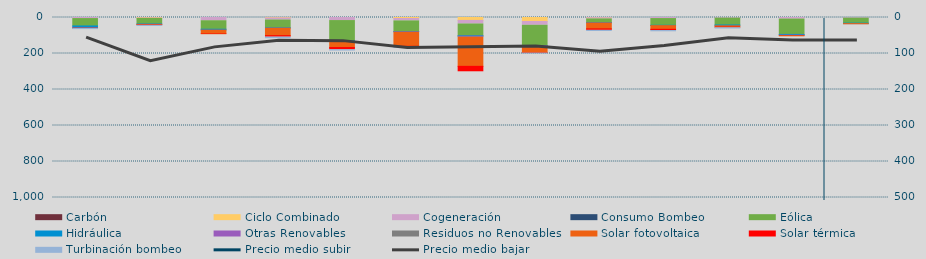
| Category | Carbón | Ciclo Combinado | Cogeneración | Consumo Bombeo | Eólica | Hidráulica | Otras Renovables | Residuos no Renovables | Solar fotovoltaica | Solar térmica | Turbinación bombeo |
|---|---|---|---|---|---|---|---|---|---|---|---|
| 0 | 0 | 0 | 5902.2 | 0 | 40924.6 | 10096 | 2210.8 | 541.2 | 397.2 | 861 | 700 |
| 1 | 0 | 2180.9 | 2937.8 | 0 | 30839.8 | 1899.6 | 565.6 | 0 | 1849.2 | 2802 | 1100 |
| 2 | 0 | 0 | 18046.2 | 0 | 47159 | 4513.5 | 523.7 | 0 | 19900.6 | 2658.1 | 0 |
| 3 | 0 | 2280 | 11810.8 | 0 | 43127.1 | 1164.1 | 1123.7 | 0 | 41530.2 | 8077.8 | 3040.7 |
| 4 | 0 | 0 | 17047.5 | 0 | 112869.5 | 3513.3 | 2033.2 | 0 | 31386.8 | 12440.9 | 1549.6 |
| 5 | 0 | 5564.7 | 13323.5 | 0 | 59321.6 | 487.1 | 2690.6 | 340 | 78205.9 | 6474.7 | 234.9 |
| 6 | 0 | 16258.4 | 19750 | 0 | 65114.4 | 2681.9 | 4946 | 396 | 162175.4 | 30259.6 | 0 |
| 7 | 0 | 22358.6 | 20882.5 | 0 | 113586.9 | 821.8 | 5978.7 | 1618 | 30024.6 | 2441 | 100 |
| 8 | 0 | 1223.5 | 6632.4 | 0 | 20394.4 | 842.9 | 1487.4 | 0 | 32658.5 | 8109.1 | 800 |
| 9 | 0 | 0 | 5876.6 | 0 | 37380.1 | 1248.7 | 505.5 | 224 | 20420.3 | 6894.4 | 1200 |
| 10 | 0 | 0 | 3323.3 | 0 | 38286.4 | 4248.1 | 635 | 0 | 7180.3 | 3217.4 | 1419.5 |
| 11 | 0 | 0 | 8632.3 | 0 | 85492.6 | 4224.9 | 2224 | 0 | 1195.9 | 1363.4 | 0 |
| 12 | 0 | 0 | 3514.4 | 0 | 27832.9 | 2604.4 | 54.8 | 0 | 744.1 | 3.7 | 0 |